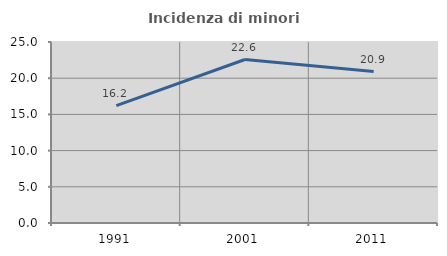
| Category | Incidenza di minori stranieri |
|---|---|
| 1991.0 | 16.216 |
| 2001.0 | 22.581 |
| 2011.0 | 20.918 |